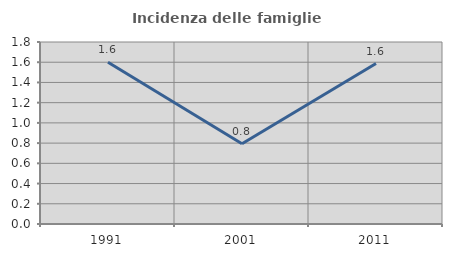
| Category | Incidenza delle famiglie numerose |
|---|---|
| 1991.0 | 1.6 |
| 2001.0 | 0.794 |
| 2011.0 | 1.587 |